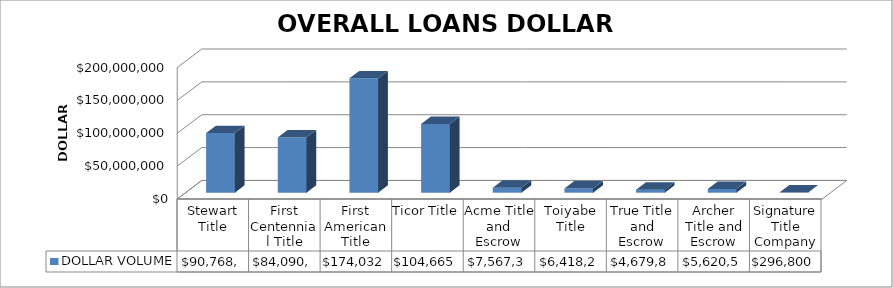
| Category | DOLLAR VOLUME |
|---|---|
| Stewart Title | 90768716 |
| First Centennial Title | 84090760.5 |
| First American Title | 174032909 |
| Ticor Title | 104665254 |
| Acme Title and Escrow | 7567350 |
| Toiyabe Title | 6418245 |
| True Title and Escrow | 4679800 |
| Archer Title and Escrow | 5620587 |
| Signature Title Company | 296800 |